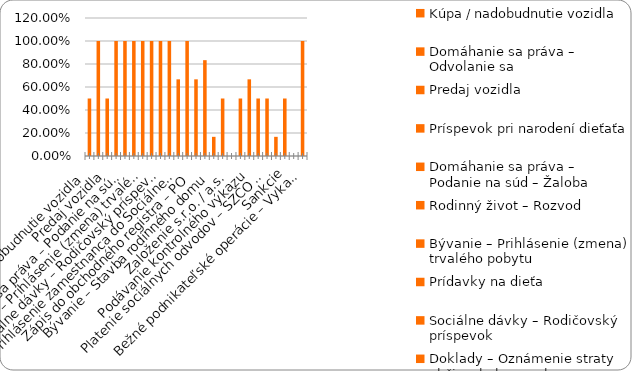
| Category | % |
|---|---|
| Kúpa / nadobudnutie vozidla | 0.5 |
| Domáhanie sa práva – Odvolanie sa | 1 |
| Predaj vozidla | 0.5 |
| Príspevok pri narodení dieťaťa | 1 |
| Domáhanie sa práva – Podanie na súd – Žaloba | 1 |
| Rodinný život – Rozvod | 1 |
| Bývanie – Prihlásenie (zmena) trvalého pobytu | 1 |
| Prídavky na dieťa | 1 |
| Sociálne dávky – Rodičovský príspevok | 1 |
| Doklady – Oznámenie straty občianskeho preukazu | 1 |
| Prihlásenie zamestnanca do Sociálnej poisťovne | 0.667 |
| Plnenie si daňových povinností – zamestnanec (FO) | 1 |
| Zápis do obchodného registra – PO | 0.667 |
| Živnosť - ukončenie | 0.833 |
| Bývanie – Stavba rodinného domu | 0.167 |
| Sociálne dávky – Príspevok v nezamestnanosti | 0.5 |
| Založenie s.r.o. / a.s. | 0 |
| Živnosť – založenie | 0.5 |
| Podávanie kontrolného výkazu | 0.667 |
| Plnenie si daňových povinností – SZČO / PO  | 0.5 |
| Platenie sociálnych odvodov – SZČO / PO | 0.5 |
| Živnosť - prerušenie | 0.167 |
| Sankcie | 0.5 |
| Živnosť - zmena | 0 |
| Bežné podnikateľské operácie – Vykazovanie štatistík | 1 |